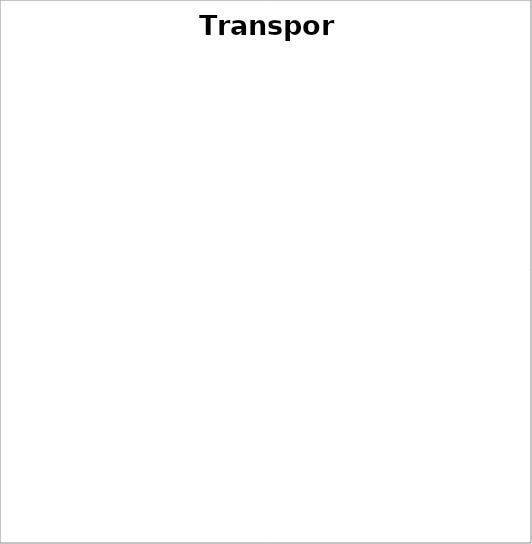
| Category | Series 0 |
|---|---|
| Crédit auto | 0 |
| Assurance auto | 0 |
| Carburant | 0 |
| Péage | 0 |
| Transports en commun | 0 |
| Autres | 0 |